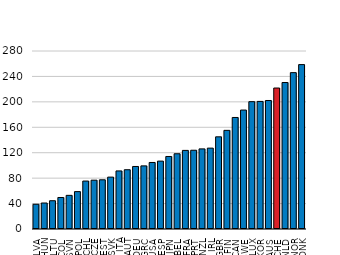
| Category | 2020 or latest available year |
|---|---|
| LVA | 38.91 |
| HUN | 40.886 |
| LTU | 44.465 |
| COL | 49.564 |
| SVN | 52.94 |
| POL | 58.808 |
| CHL | 75.427 |
| CZE | 76.801 |
| EST | 77.397 |
| SVK | 81.612 |
| ITA | 91.355 |
| AUT | 93.247 |
| DEU | 98.362 |
| GRC | 99.296 |
| USA | 104.633 |
| ESP | 106.77 |
| JPN | 114.086 |
| BEL | 118.356 |
| FRA | 123.638 |
| PRT | 123.89 |
| NZL | 126.008 |
| IRL | 127.21 |
| GBR | 145.013 |
| FIN | 155.165 |
| CAN | 175.431 |
| SWE | 187.116 |
| LUX | 200.293 |
| KOR | 200.699 |
| AUS | 202.137 |
| CHE | 221.766 |
| NLD | 230.422 |
| NOR | 245.973 |
| DNK | 258.596 |